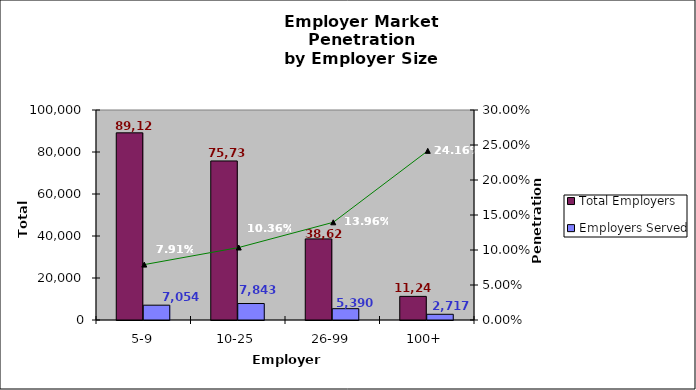
| Category | Total Employers | Employers Served |
|---|---|---|
| 5-9 | 89129 | 7054 |
| 10-25 | 75730 | 7843 |
| 26-99 | 38623 | 5390 |
| 100+ | 11244 | 2717 |